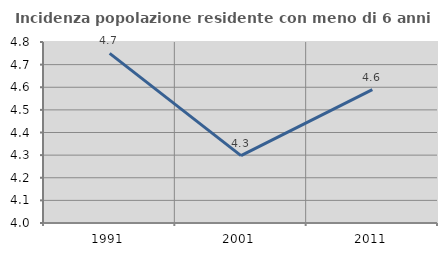
| Category | Incidenza popolazione residente con meno di 6 anni |
|---|---|
| 1991.0 | 4.75 |
| 2001.0 | 4.298 |
| 2011.0 | 4.589 |